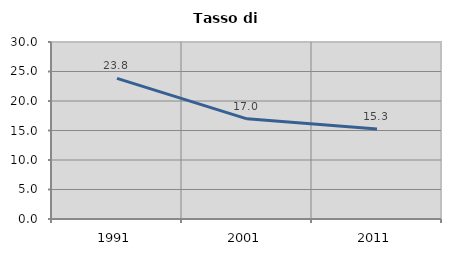
| Category | Tasso di disoccupazione   |
|---|---|
| 1991.0 | 23.843 |
| 2001.0 | 16.981 |
| 2011.0 | 15.252 |